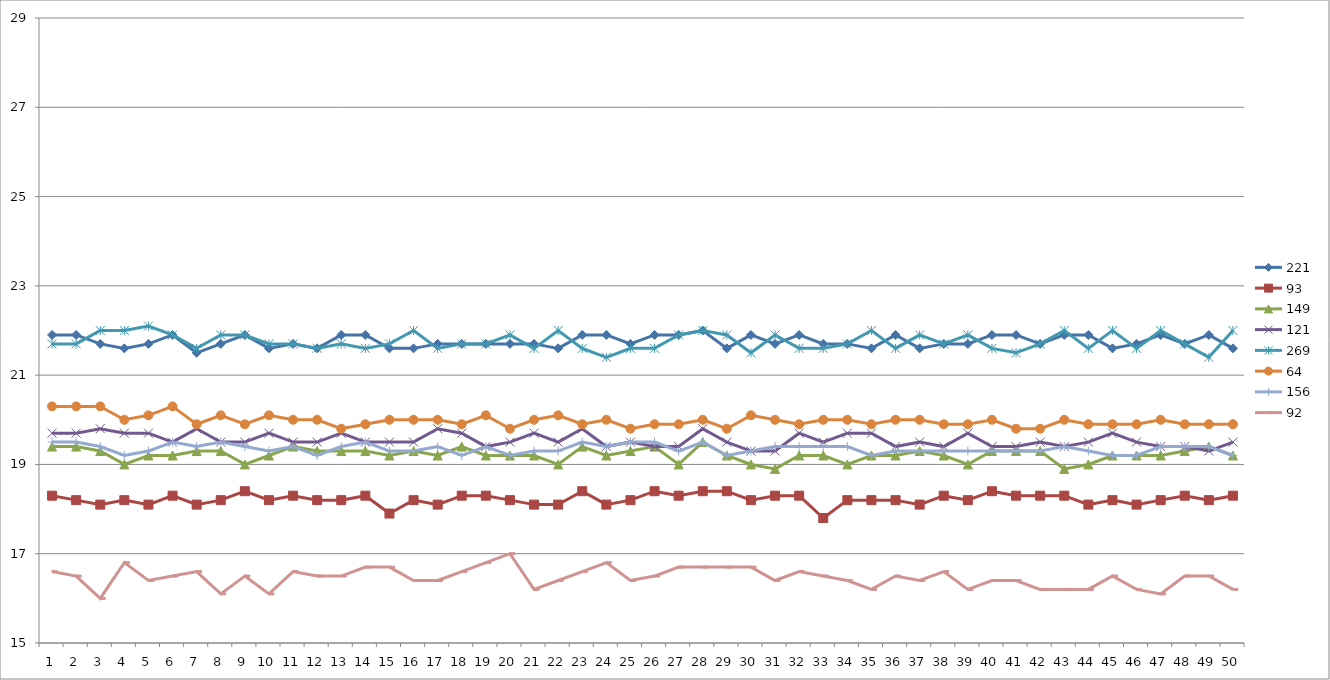
| Category | 221 | 93 | 149 | 121 | 269 | 64 | 156 | 92 |
|---|---|---|---|---|---|---|---|---|
| 0 | 21.9 | 18.3 | 19.4 | 19.7 | 21.7 | 20.3 | 19.5 | 16.6 |
| 1 | 21.9 | 18.2 | 19.4 | 19.7 | 21.7 | 20.3 | 19.5 | 16.5 |
| 2 | 21.7 | 18.1 | 19.3 | 19.8 | 22 | 20.3 | 19.4 | 16 |
| 3 | 21.6 | 18.2 | 19 | 19.7 | 22 | 20 | 19.2 | 16.8 |
| 4 | 21.7 | 18.1 | 19.2 | 19.7 | 22.1 | 20.1 | 19.3 | 16.4 |
| 5 | 21.9 | 18.3 | 19.2 | 19.5 | 21.9 | 20.3 | 19.5 | 16.5 |
| 6 | 21.5 | 18.1 | 19.3 | 19.8 | 21.6 | 19.9 | 19.4 | 16.6 |
| 7 | 21.7 | 18.2 | 19.3 | 19.5 | 21.9 | 20.1 | 19.5 | 16.1 |
| 8 | 21.9 | 18.4 | 19 | 19.5 | 21.9 | 19.9 | 19.4 | 16.5 |
| 9 | 21.6 | 18.2 | 19.2 | 19.7 | 21.7 | 20.1 | 19.3 | 16.1 |
| 10 | 21.7 | 18.3 | 19.4 | 19.5 | 21.7 | 20 | 19.4 | 16.6 |
| 11 | 21.6 | 18.2 | 19.3 | 19.5 | 21.6 | 20 | 19.2 | 16.5 |
| 12 | 21.9 | 18.2 | 19.3 | 19.7 | 21.7 | 19.8 | 19.4 | 16.5 |
| 13 | 21.9 | 18.3 | 19.3 | 19.5 | 21.6 | 19.9 | 19.5 | 16.7 |
| 14 | 21.6 | 17.9 | 19.2 | 19.5 | 21.7 | 20 | 19.3 | 16.7 |
| 15 | 21.6 | 18.2 | 19.3 | 19.5 | 22 | 20 | 19.3 | 16.4 |
| 16 | 21.7 | 18.1 | 19.2 | 19.8 | 21.6 | 20 | 19.4 | 16.4 |
| 17 | 21.7 | 18.3 | 19.4 | 19.7 | 21.7 | 19.9 | 19.2 | 16.6 |
| 18 | 21.7 | 18.3 | 19.2 | 19.4 | 21.7 | 20.1 | 19.4 | 16.8 |
| 19 | 21.7 | 18.2 | 19.2 | 19.5 | 21.9 | 19.8 | 19.2 | 17 |
| 20 | 21.7 | 18.1 | 19.2 | 19.7 | 21.6 | 20 | 19.3 | 16.2 |
| 21 | 21.6 | 18.1 | 19 | 19.5 | 22 | 20.1 | 19.3 | 16.4 |
| 22 | 21.9 | 18.4 | 19.4 | 19.8 | 21.6 | 19.9 | 19.5 | 16.6 |
| 23 | 21.9 | 18.1 | 19.2 | 19.4 | 21.4 | 20 | 19.4 | 16.8 |
| 24 | 21.7 | 18.2 | 19.3 | 19.5 | 21.6 | 19.8 | 19.5 | 16.4 |
| 25 | 21.9 | 18.4 | 19.4 | 19.4 | 21.6 | 19.9 | 19.5 | 16.5 |
| 26 | 21.9 | 18.3 | 19 | 19.4 | 21.9 | 19.9 | 19.3 | 16.7 |
| 27 | 22 | 18.4 | 19.5 | 19.8 | 22 | 20 | 19.5 | 16.7 |
| 28 | 21.6 | 18.4 | 19.2 | 19.5 | 21.9 | 19.8 | 19.2 | 16.7 |
| 29 | 21.9 | 18.2 | 19 | 19.3 | 21.5 | 20.1 | 19.3 | 16.7 |
| 30 | 21.7 | 18.3 | 18.9 | 19.3 | 21.9 | 20 | 19.4 | 16.4 |
| 31 | 21.9 | 18.3 | 19.2 | 19.7 | 21.6 | 19.9 | 19.4 | 16.6 |
| 32 | 21.7 | 17.8 | 19.2 | 19.5 | 21.6 | 20 | 19.4 | 16.5 |
| 33 | 21.7 | 18.2 | 19 | 19.7 | 21.7 | 20 | 19.4 | 16.4 |
| 34 | 21.6 | 18.2 | 19.2 | 19.7 | 22 | 19.9 | 19.2 | 16.2 |
| 35 | 21.9 | 18.2 | 19.2 | 19.4 | 21.6 | 20 | 19.3 | 16.5 |
| 36 | 21.6 | 18.1 | 19.3 | 19.5 | 21.9 | 20 | 19.3 | 16.4 |
| 37 | 21.7 | 18.3 | 19.2 | 19.4 | 21.7 | 19.9 | 19.3 | 16.6 |
| 38 | 21.7 | 18.2 | 19 | 19.7 | 21.9 | 19.9 | 19.3 | 16.2 |
| 39 | 21.9 | 18.4 | 19.3 | 19.4 | 21.6 | 20 | 19.3 | 16.4 |
| 40 | 21.9 | 18.3 | 19.3 | 19.4 | 21.5 | 19.8 | 19.3 | 16.4 |
| 41 | 21.7 | 18.3 | 19.3 | 19.5 | 21.7 | 19.8 | 19.3 | 16.2 |
| 42 | 21.9 | 18.3 | 18.9 | 19.4 | 22 | 20 | 19.4 | 16.2 |
| 43 | 21.9 | 18.1 | 19 | 19.5 | 21.6 | 19.9 | 19.3 | 16.2 |
| 44 | 21.6 | 18.2 | 19.2 | 19.7 | 22 | 19.9 | 19.2 | 16.5 |
| 45 | 21.7 | 18.1 | 19.2 | 19.5 | 21.6 | 19.9 | 19.2 | 16.2 |
| 46 | 21.9 | 18.2 | 19.2 | 19.4 | 22 | 20 | 19.4 | 16.1 |
| 47 | 21.7 | 18.3 | 19.3 | 19.4 | 21.7 | 19.9 | 19.4 | 16.5 |
| 48 | 21.9 | 18.2 | 19.4 | 19.3 | 21.4 | 19.9 | 19.4 | 16.5 |
| 49 | 21.6 | 18.3 | 19.2 | 19.5 | 22 | 19.9 | 19.2 | 16.2 |